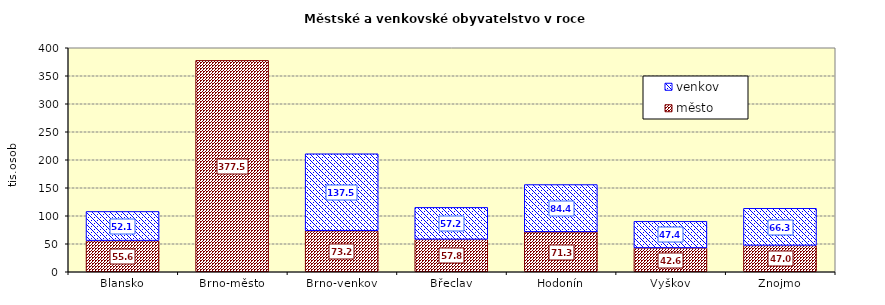
| Category | město | venkov |
|---|---|---|
| Blansko | 55603 | 52143 |
| Brno-město | 377508 | 0 |
| Brno-venkov | 73222 | 137507 |
| Břeclav | 57827 | 57151 |
| Hodonín | 71331 | 84411 |
| Vyškov | 42597 | 47444 |
| Znojmo | 47008 | 66326 |